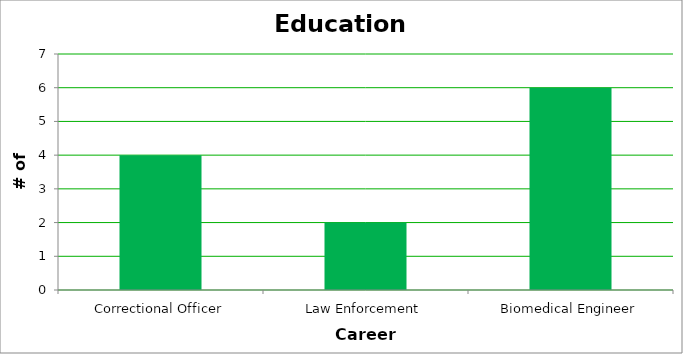
| Category | Series 0 |
|---|---|
| Correctional Officer | 4 |
| Law Enforcement | 2 |
| Biomedical Engineer | 6 |